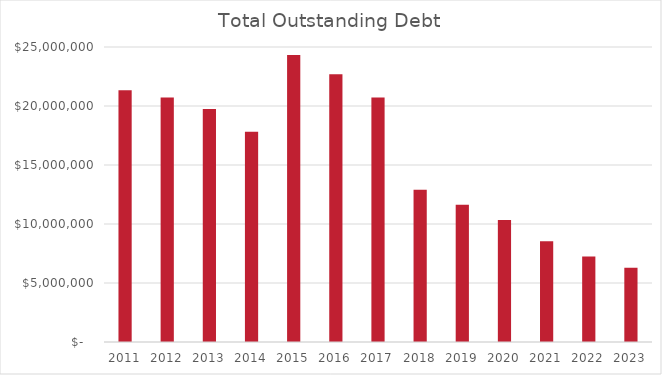
| Category | Series 0 |
|---|---|
| 2011.0 | 21335837 |
| 2012.0 | 20710102 |
| 2013.0 | 19739093 |
| 2014.0 | 17814600 |
| 2015.0 | 24320495 |
| 2016.0 | 22685134 |
| 2017.0 | 20715728 |
| 2018.0 | 12911321 |
| 2019.0 | 11641096 |
| 2020.0 | 10340871 |
| 2021.0 | 8540000 |
| 2022.0 | 7250000 |
| 2023.0 | 6292875 |